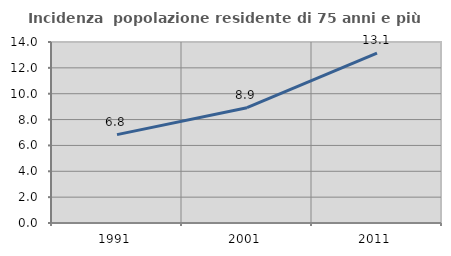
| Category | Incidenza  popolazione residente di 75 anni e più |
|---|---|
| 1991.0 | 6.837 |
| 2001.0 | 8.919 |
| 2011.0 | 13.142 |